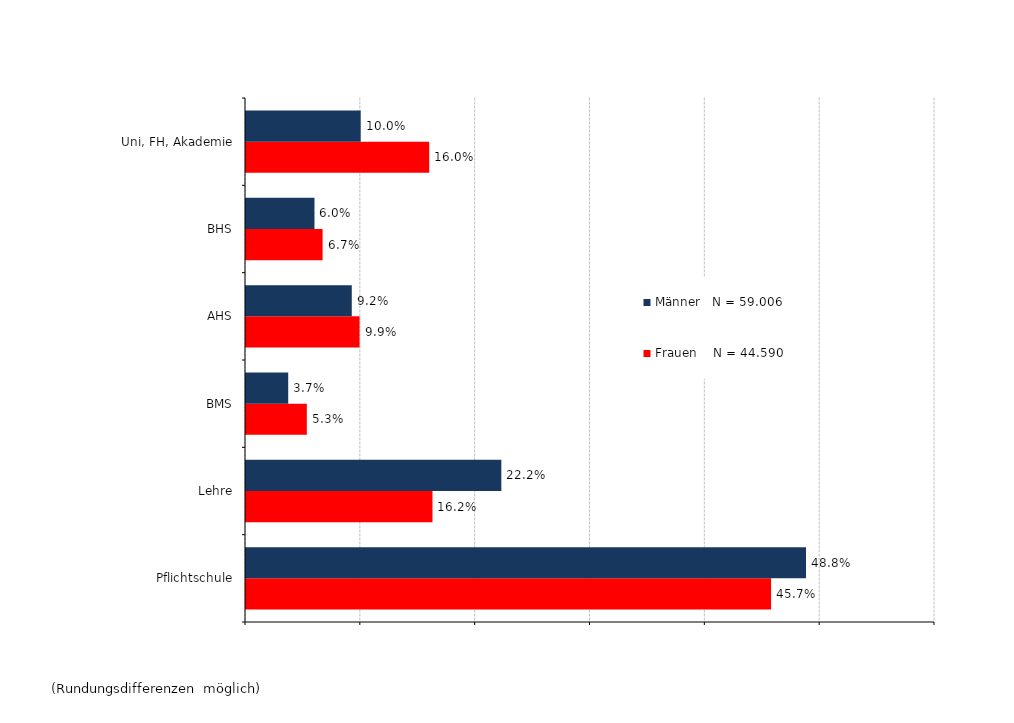
| Category | Frauen    N = 44.590 | Männer   N = 59.006 |
|---|---|---|
| Pflichtschule | 0.457 | 0.488 |
| Lehre | 0.162 | 0.222 |
| BMS | 0.053 | 0.037 |
| AHS | 0.099 | 0.092 |
| BHS | 0.067 | 0.06 |
| Uni, FH, Akademie | 0.16 | 0.1 |